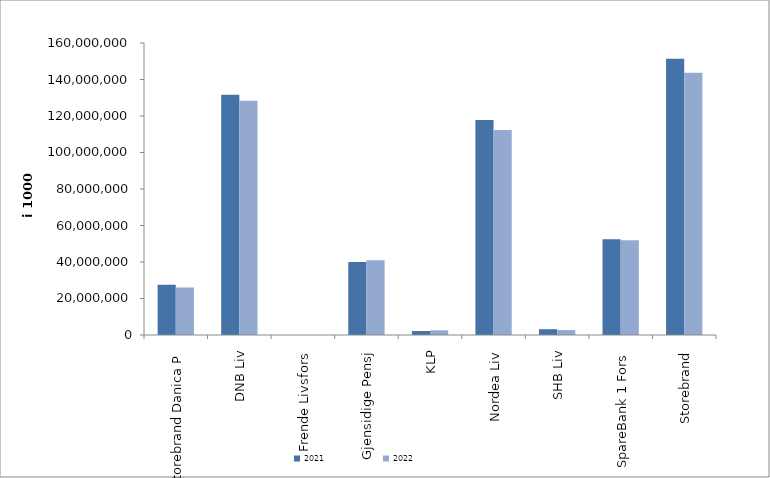
| Category | 2021 | 2022 |
|---|---|---|
| Storebrand Danica P | 27529054.677 | 26046630.69 |
| DNB Liv | 131616569.77 | 128365139 |
| Frende Livsfors | 0 | 0 |
| Gjensidige Pensj | 40002105.3 | 40928356 |
| KLP | 2172918.861 | 2548669.298 |
| Nordea Liv | 117827820 | 112327400 |
| SHB Liv | 3184098.707 | 2698313.846 |
| SpareBank 1 Fors | 52494337.715 | 51982267.81 |
| Storebrand | 151409583.368 | 143649383.581 |